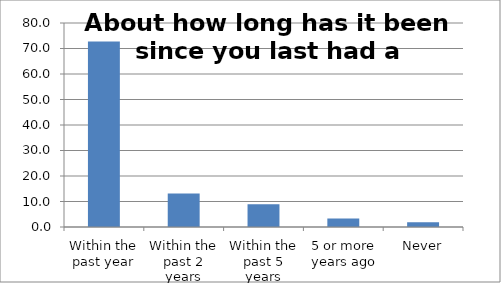
| Category | Series 0 |
|---|---|
| Within the past year | 72.707 |
| Within the past 2 years | 13.127 |
| Within the past 5 years | 8.951 |
| 5 or more years ago | 3.344 |
| Never | 1.871 |